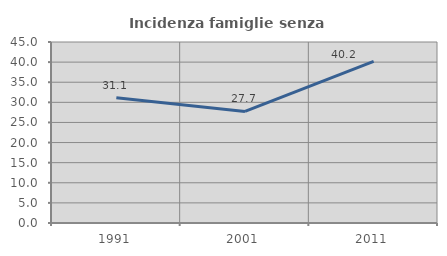
| Category | Incidenza famiglie senza nuclei |
|---|---|
| 1991.0 | 31.119 |
| 2001.0 | 27.74 |
| 2011.0 | 40.19 |